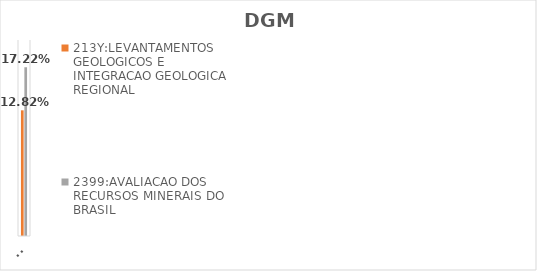
| Category | 213Y:LEVANTAMENTOS GEOLOGICOS E INTEGRACAO GEOLOGICA REGIONAL | 2399:AVALIACAO DOS RECURSOS MINERAIS DO BRASIL |
|---|---|---|
| EXECUTADO | 0.128 | 0.172 |